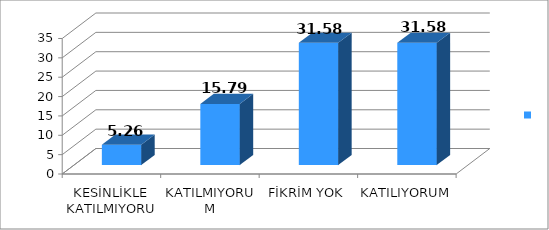
| Category | Series 0 |
|---|---|
| KESİNLİKLE KATILMIYORUM | 5.26 |
| KATILMIYORUM | 15.79 |
| FİKRİM YOK | 31.58 |
| KATILIYORUM | 31.58 |